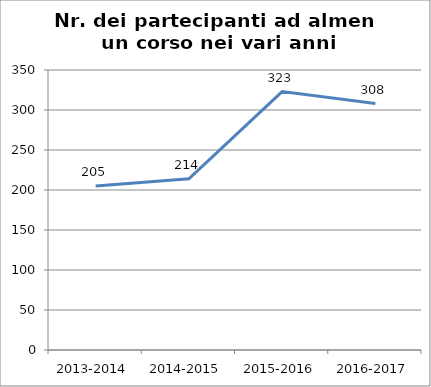
| Category | Nr. Partecipanti ad almeno un Corso |
|---|---|
| 2013-2014 | 205 |
| 2014-2015 | 214 |
| 2015-2016 | 323 |
| 2016-2017 | 308 |